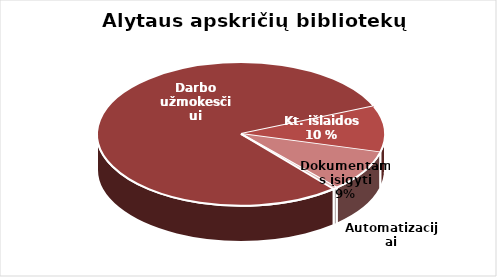
| Category | Series 0 |
|---|---|
| Darbo užmokesčiui | 2348866.32 |
| Kitos | 306317.12 |
| Dokumentams įsigyti | 274147.61 |
| Automatizacijai | 12948.67 |